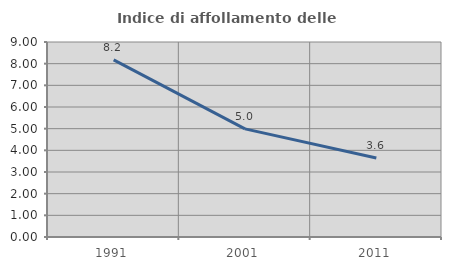
| Category | Indice di affollamento delle abitazioni  |
|---|---|
| 1991.0 | 8.177 |
| 2001.0 | 4.989 |
| 2011.0 | 3.645 |